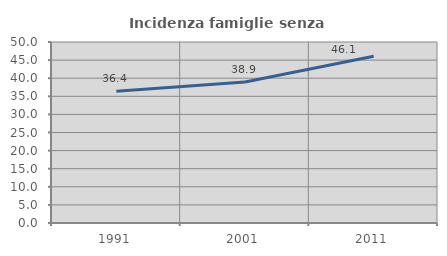
| Category | Incidenza famiglie senza nuclei |
|---|---|
| 1991.0 | 36.404 |
| 2001.0 | 38.939 |
| 2011.0 | 46.082 |